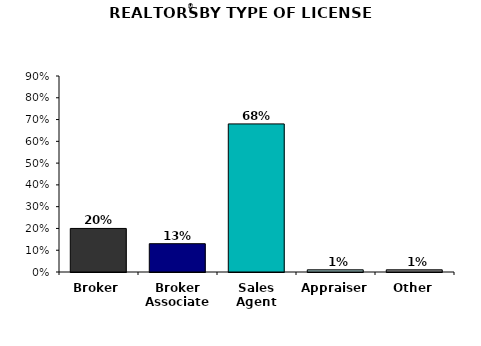
| Category | Series 0 |
|---|---|
| Broker | 20 |
| Broker Associate | 13 |
| Sales Agent | 68 |
| Appraiser | 1 |
| Other | 1 |